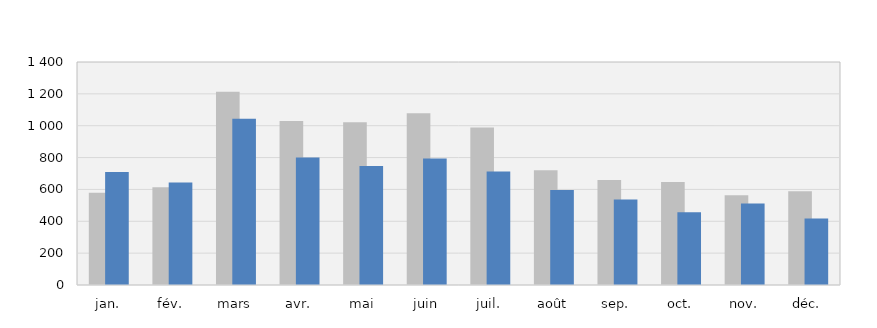
| Category | 2021 | 2022 |
|---|---|---|
| jan. | 579 | 710 |
| fév. | 614 | 644 |
| mars | 1214 | 1043 |
| avr. | 1030 | 800 |
| mai | 1022 | 747 |
| juin | 1079 | 794 |
| juil. | 989 | 713 |
| août | 721 | 597 |
| sep. | 659 | 537 |
| oct. | 646 | 457 |
| nov. | 564 | 512 |
| déc. | 589 | 418 |